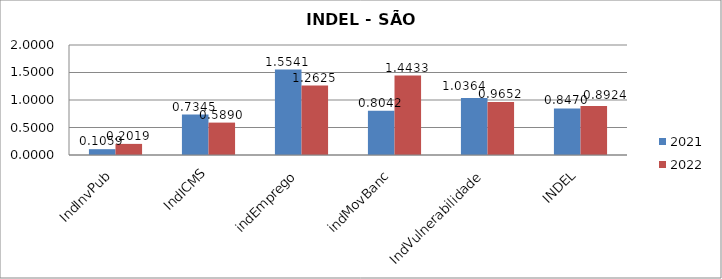
| Category | 2021 | 2022 |
|---|---|---|
| IndInvPub | 0.106 | 0.202 |
| IndICMS | 0.734 | 0.589 |
| indEmprego | 1.554 | 1.263 |
| indMovBanc | 0.804 | 1.443 |
| IndVulnerabilidade | 1.036 | 0.965 |
| INDEL | 0.847 | 0.892 |